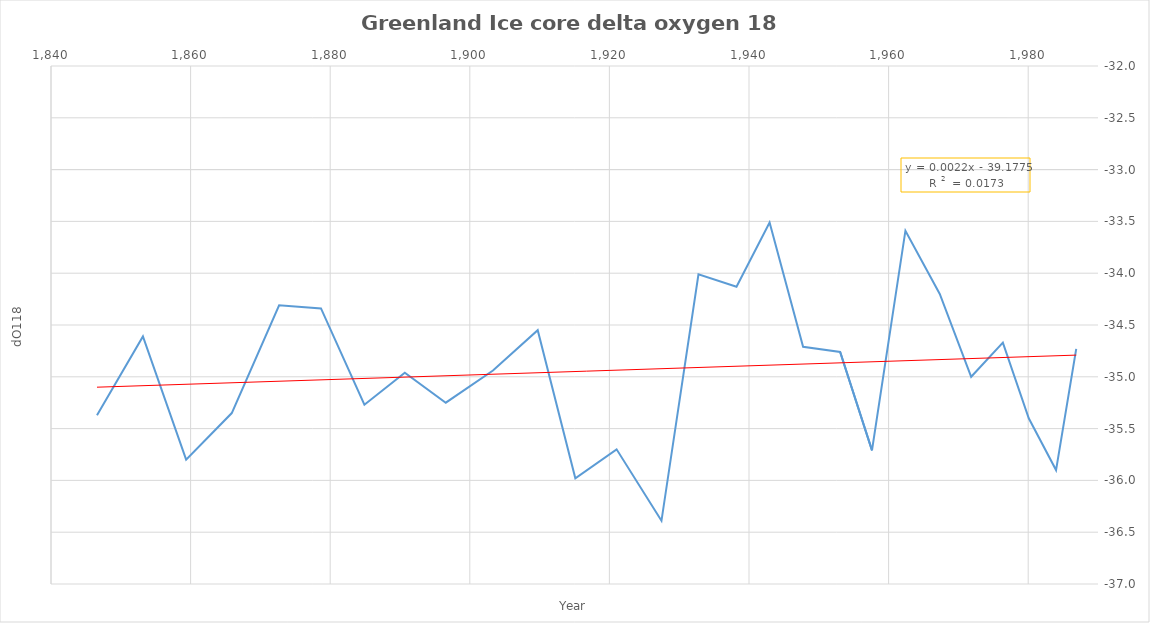
| Category | Series 0 |
|---|---|
| 1986.88 | -34.73 |
| 1983.99 | -35.9 |
| 1980.08 | -35.4 |
| 1976.37 | -34.67 |
| 1971.83 | -35 |
| 1967.33 | -34.2 |
| 1962.41 | -33.59 |
| 1957.62 | -35.71 |
| 1953.06 | -34.76 |
| 1947.75 | -34.71 |
| 1942.95 | -33.51 |
| 1938.21 | -34.13 |
| 1932.76 | -34.01 |
| 1927.46 | -36.39 |
| 1921.03 | -35.7 |
| 1915.12 | -35.98 |
| 1909.73 | -34.55 |
| 1903.32 | -34.94 |
| 1896.56 | -35.25 |
| 1890.69 | -34.96 |
| 1884.9 | -35.27 |
| 1878.68 | -34.34 |
| 1872.68 | -34.31 |
| 1865.9 | -35.35 |
| 1859.36 | -35.8 |
| 1853.17 | -34.61 |
| 1846.59 | -35.37 |